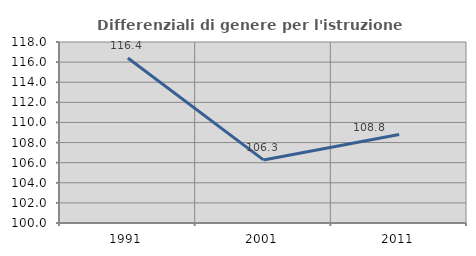
| Category | Differenziali di genere per l'istruzione superiore |
|---|---|
| 1991.0 | 116.406 |
| 2001.0 | 106.274 |
| 2011.0 | 108.795 |